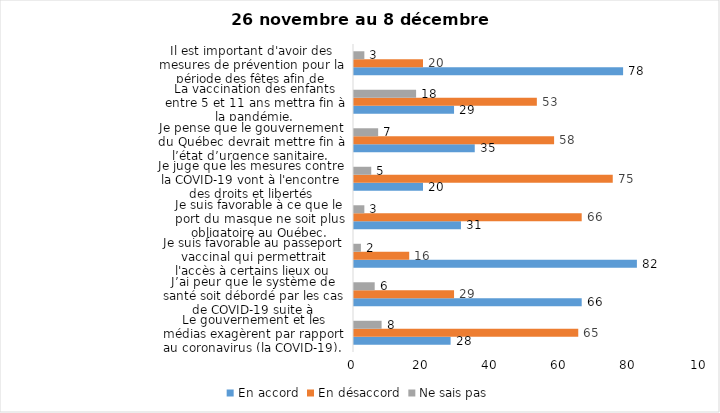
| Category | En accord | En désaccord | Ne sais pas |
|---|---|---|---|
| Le gouvernement et les médias exagèrent par rapport au coronavirus (la COVID-19). | 28 | 65 | 8 |
| J’ai peur que le système de santé soit débordé par les cas de COVID-19 suite à l’assouplissement des mesures | 66 | 29 | 6 |
| Je suis favorable au passeport vaccinal qui permettrait l'accès à certains lieux ou activités aux personnes vaccinées. | 82 | 16 | 2 |
| Je suis favorable à ce que le port du masque ne soit plus obligatoire au Québec. | 31 | 66 | 3 |
| Je juge que les mesures contre la COVID-19 vont à l'encontre des droits et libertés individuelles.  | 20 | 75 | 5 |
| Je pense que le gouvernement du Québec devrait mettre fin à l’état d’urgence sanitaire.  | 35 | 58 | 7 |
| La vaccination des enfants entre 5 et 11 ans mettra fin à la pandémie. | 29 | 53 | 18 |
| Il est important d'avoir des mesures de prévention pour la période des fêtes afin de limiter la propagation de la COVID-19. | 78 | 20 | 3 |